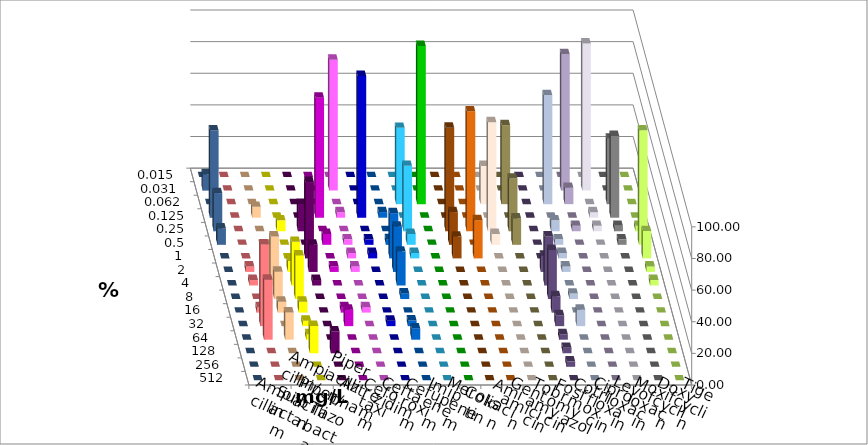
| Category | Ampicillin | Ampicillin/ Sulbactam | Piperacillin | Piperacillin/ Tazobactam | Aztreonam | Cefotaxim | Ceftazidim | Cefuroxim | Imipenem | Meropenem | Colistin | Amikacin | Gentamicin | Tobramycin | Fosfomycin | Cotrimoxazol | Ciprofloxacin | Levofloxacin | Moxifloxacin | Doxycyclin | Tigecyclin |
|---|---|---|---|---|---|---|---|---|---|---|---|---|---|---|---|---|---|---|---|---|---|
| 0.015 | 0 | 0 | 0 | 0 | 0 | 0 | 0 | 0 | 0 | 0 | 0 | 0 | 0 | 0 | 0 | 0 | 0 | 0 | 0 | 0 | 0 |
| 0.031 | 0 | 0 | 0 | 0 | 0 | 82.759 | 0 | 0 | 0 | 0 | 0 | 0 | 0 | 0 | 0 | 0 | 86.207 | 93.103 | 0 | 0 | 10.345 |
| 0.062 | 0 | 0 | 0 | 0 | 0 | 0 | 0 | 0 | 48.276 | 100 | 0 | 0 | 24.138 | 50 | 0 | 68.966 | 10.345 | 0 | 41.379 | 0 | 0 |
| 0.125 | 0 | 6.897 | 0 | 0 | 75.862 | 3.448 | 89.655 | 3.571 | 0 | 0 | 0 | 0 | 0 | 0 | 0 | 0 | 0 | 3.448 | 51.724 | 0 | 55.172 |
| 0.25 | 0 | 0 | 6.897 | 17.241 | 0 | 0 | 0 | 0 | 41.379 | 0 | 65.517 | 75.862 | 68.966 | 33.333 | 0 | 6.897 | 3.448 | 3.448 | 3.448 | 3.448 | 24.138 |
| 0.5 | 0 | 0 | 0 | 0 | 6.897 | 3.448 | 3.448 | 3.571 | 6.897 | 0 | 20.69 | 0 | 6.897 | 16.667 | 0 | 3.448 | 0 | 0 | 3.448 | 72.414 | 10.345 |
| 1.0 | 0 | 3.448 | 0 | 48.276 | 0 | 3.448 | 3.448 | 28.571 | 3.448 | 0 | 13.793 | 24.138 | 0 | 0 | 0 | 3.448 | 0 | 0 | 0 | 17.241 | 0 |
| 2.0 | 3.448 | 17.241 | 6.897 | 17.241 | 3.448 | 3.448 | 0 | 28.571 | 0 | 0 | 0 | 0 | 0 | 0 | 10.345 | 3.448 | 0 | 0 | 0 | 3.448 | 0 |
| 4.0 | 3.448 | 31.034 | 27.586 | 3.448 | 0 | 0 | 0 | 21.429 | 0 | 0 | 0 | 0 | 0 | 0 | 31.034 | 0 | 0 | 0 | 0 | 3.448 | 0 |
| 8.0 | 0 | 17.241 | 27.586 | 0 | 0 | 0 | 0 | 3.571 | 0 | 0 | 0 | 0 | 0 | 0 | 31.034 | 3.448 | 0 | 0 | 0 | 0 | 0 |
| 16.0 | 3.448 | 6.897 | 6.897 | 0 | 3.448 | 3.448 | 0 | 0 | 0 | 0 | 0 | 0 | 0 | 0 | 10.345 | 0 | 0 | 0 | 0 | 0 | 0 |
| 32.0 | 51.724 | 0 | 3.448 | 0 | 10.345 | 0 | 3.448 | 3.571 | 0 | 0 | 0 | 0 | 0 | 0 | 6.897 | 10.345 | 0 | 0 | 0 | 0 | 0 |
| 64.0 | 37.931 | 17.241 | 3.448 | 0 | 0 | 0 | 0 | 7.143 | 0 | 0 | 0 | 0 | 0 | 0 | 3.448 | 0 | 0 | 0 | 0 | 0 | 0 |
| 128.0 | 0 | 0 | 17.241 | 13.793 | 0 | 0 | 0 | 0 | 0 | 0 | 0 | 0 | 0 | 0 | 3.448 | 0 | 0 | 0 | 0 | 0 | 0 |
| 256.0 | 0 | 0 | 0 | 0 | 0 | 0 | 0 | 0 | 0 | 0 | 0 | 0 | 0 | 0 | 3.448 | 0 | 0 | 0 | 0 | 0 | 0 |
| 512.0 | 0 | 0 | 0 | 0 | 0 | 0 | 0 | 0 | 0 | 0 | 0 | 0 | 0 | 0 | 0 | 0 | 0 | 0 | 0 | 0 | 0 |